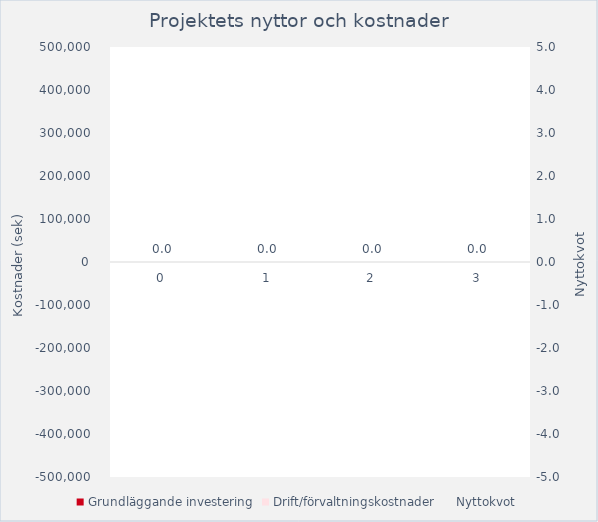
| Category | Grundläggande investering | Drift/förvaltningskostnader |
|---|---|---|
| 0.0 | 0 | 0 |
| 1.0 | 0 | 0 |
| 2.0 | 0 | 0 |
| 3.0 | 0 | 0 |